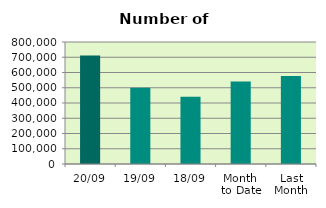
| Category | Series 0 |
|---|---|
| 20/09 | 711206 |
| 19/09 | 499712 |
| 18/09 | 440278 |
| Month 
to Date | 541491.467 |
| Last
Month | 576518.909 |